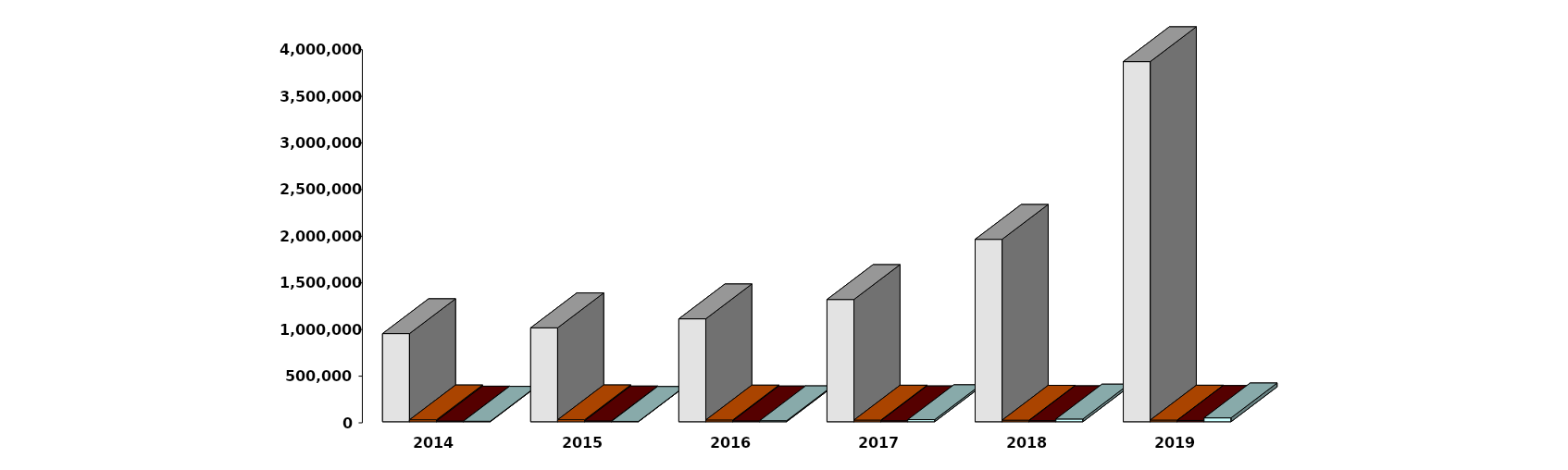
| Category | Физические лица | Юридические лица | Иностранные лица | Клиенты, передавшие свои средства в ДУ |
|---|---|---|---|---|
| 2014-12-31 | 944559 | 20178 | 7486 | 5142 |
| 2015-12-31 | 1006751 | 20753 | 8729 | 3836 |
| 2016-12-31 | 1102966 | 18622 | 9215 | 10694 |
| 2017-12-31 | 1310296 | 17766 | 10211 | 22564 |
| 2018-12-31 | 1955118 | 16631 | 11453 | 29262 |
| 2019-12-31 | 3859911 | 17695 | 14011 | 41535 |